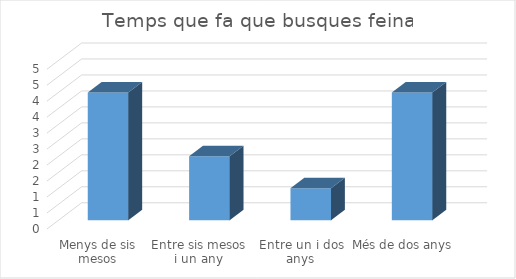
| Category | Series 0 |
|---|---|
| Menys de sis mesos | 4 |
| Entre sis mesos i un any | 2 |
| Entre un i dos anys | 1 |
| Més de dos anys | 4 |